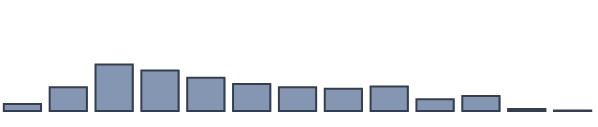
| Category | Series 0 |
|---|---|
| 0 | 2.5 |
| 1 | 8.561 |
| 2 | 16.742 |
| 3 | 14.621 |
| 4 | 11.97 |
| 5 | 9.773 |
| 6 | 8.561 |
| 7 | 8.03 |
| 8 | 8.788 |
| 9 | 4.242 |
| 10 | 5.379 |
| 11 | 0.682 |
| 12 | 0.152 |